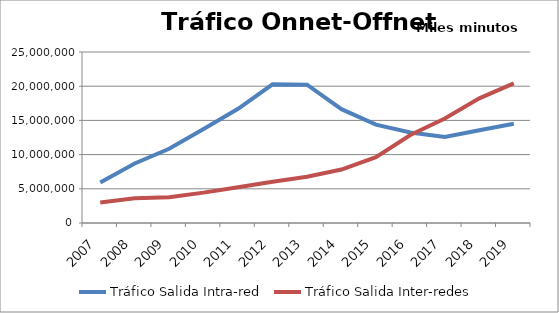
| Category | Tráfico Salida Intra-red | Tráfico Salida Inter-redes |
|---|---|---|
| 2007.0 | 5904083.795 | 3007133.407 |
| 2008.0 | 8700474.341 | 3605725.198 |
| 2009.0 | 10848127.978 | 3777186.553 |
| 2010.0 | 13731169.756 | 4442212.593 |
| 2011.0 | 16701623.385 | 5230021.942 |
| 2012.0 | 20281369.71 | 6022295.52 |
| 2013.0 | 20221752.311 | 6753941.544 |
| 2014.0 | 16638252.145 | 7814497.129 |
| 2015.0 | 14381121.54 | 9633316.484 |
| 2016.0 | 13225230.314 | 12856929.179 |
| 2017.0 | 12578132.761 | 15268259.097 |
| 2018.0 | 13561366.511 | 18231708.333 |
| 2019.0 | 14512688.723 | 20417632.119 |